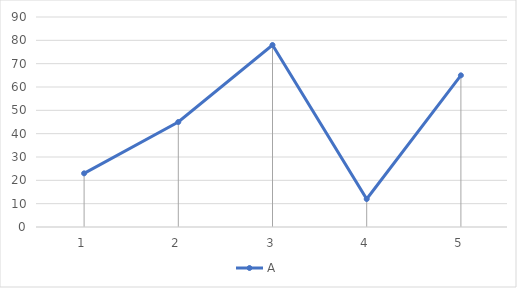
| Category | A |
|---|---|
| 0 | 23 |
| 1 | 45 |
| 2 | 78 |
| 3 | 12 |
| 4 | 65 |